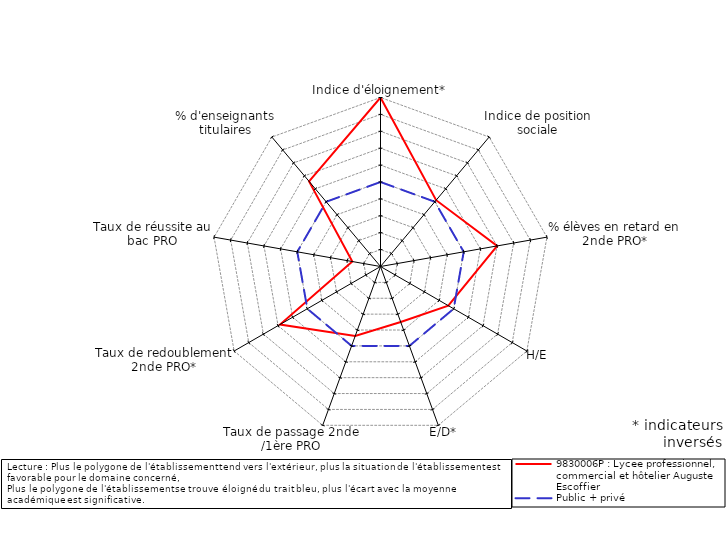
| Category | 9830006P : Lycee professionnel, commercial et hôtelier Auguste Escoffier | Public + privé |
|---|---|---|
| Indice d'éloignement* | 5 | 0 |
| Indice de position sociale | 0.121 | 0 |
| % élèves en retard en 2nde PRO* | 2.009 | 0 |
| H/E | -0.368 | 0 |
| E/D* | -1.503 | 0 |
| Taux de passage 2nde /1ère PRO | -0.623 | 0 |
| Taux de redoublement 2nde PRO* | 1.863 | 0 |
| Taux de réussite au bac PRO | -3.306 | 0 |
| % d'enseignants titulaires | 1.574 | 0 |